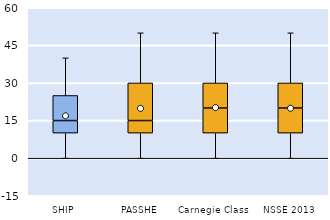
| Category | 25th | 50th | 75th |
|---|---|---|---|
| SHIP | 10 | 5 | 10 |
| PASSHE | 10 | 5 | 15 |
| Carnegie Class | 10 | 10 | 10 |
| NSSE 2013 | 10 | 10 | 10 |